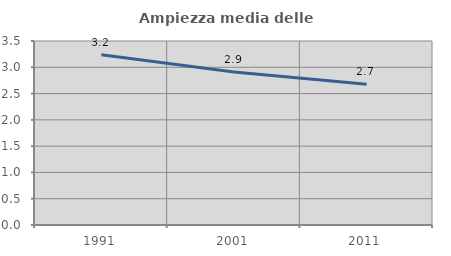
| Category | Ampiezza media delle famiglie |
|---|---|
| 1991.0 | 3.24 |
| 2001.0 | 2.91 |
| 2011.0 | 2.676 |